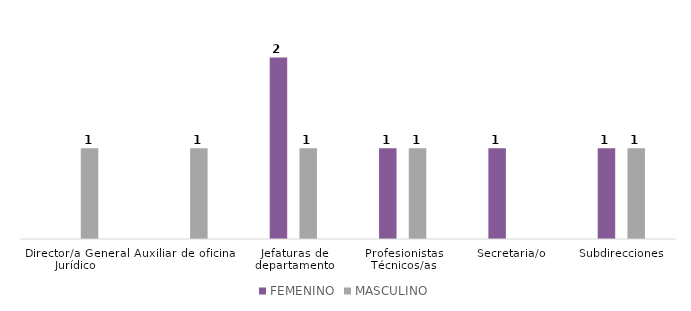
| Category | FEMENINO | MASCULINO |
|---|---|---|
| Director/a General Jurídico | 0 | 1 |
| Auxiliar de oficina | 0 | 1 |
| Jefaturas de departamento | 2 | 1 |
| Profesionistas Técnicos/as | 1 | 1 |
| Secretaria/o | 1 | 0 |
| Subdirecciones | 1 | 1 |